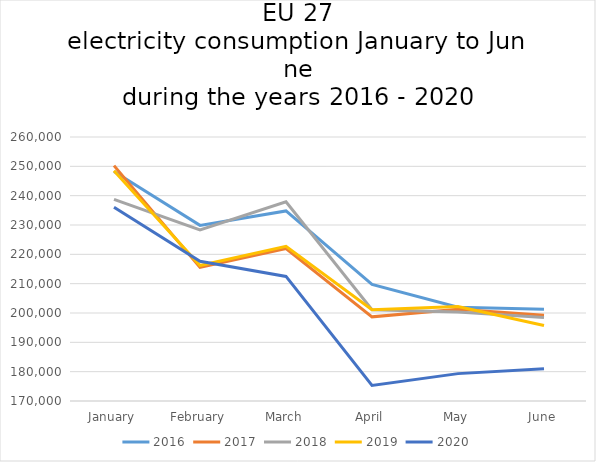
| Category | 2016 | 2017 | 2018 | 2019 | 2020 |
|---|---|---|---|---|---|
| January | 248218 | 250247.198 | 238708.973 | 248490.174 | 236051.818 |
| February | 229877 | 215547.51 | 228306.663 | 216201.964 | 217618.788 |
| March | 234803 | 221961.084 | 237927.331 | 222705.845 | 212470.747 |
| April | 209730 | 198690.405 | 201125.417 | 201115.48 | 175327.265 |
| May | 201952 | 201315.574 | 200341.009 | 202182.233 | 179332.544 |
| June | 201303 | 199208 | 198451 | 195761 | 180960 |